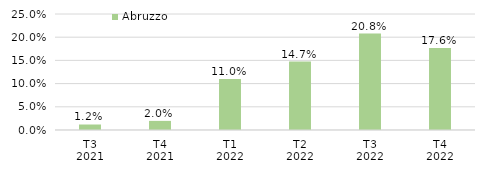
| Category | Abruzzo |
|---|---|
| T3
2021 | 0.012 |
| T4
2021 | 0.02 |
| T1
2022 | 0.11 |
| T2
2022 | 0.147 |
| T3
2022 | 0.208 |
| T4
2022 | 0.176 |